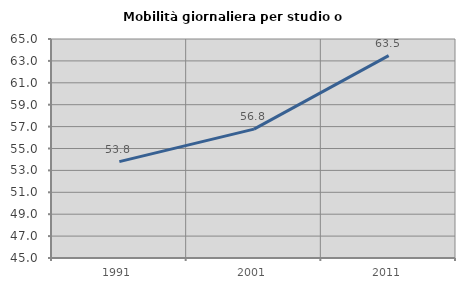
| Category | Mobilità giornaliera per studio o lavoro |
|---|---|
| 1991.0 | 53.799 |
| 2001.0 | 56.771 |
| 2011.0 | 63.485 |